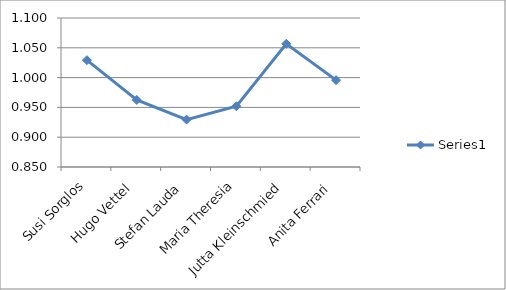
| Category | Series 0 |
|---|---|
| Susi Sorglos | 1.029 |
| Hugo Vettel | 0.963 |
| Stefan Lauda | 0.93 |
| Maria Theresia | 0.952 |
| Jutta Kleinschmied | 1.057 |
| Anita Ferrari | 0.996 |